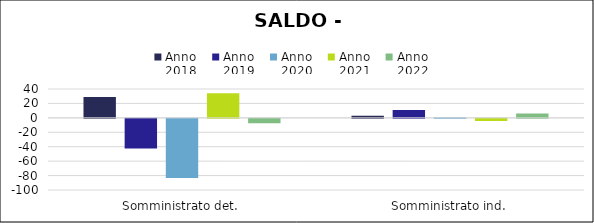
| Category | Anno
2018 | Anno
2019 | Anno
2020 | Anno
2021 | Anno
2022 |
|---|---|---|---|---|---|
| Somministrato det. | 29 | -41 | -82 | 34 | -6 |
| Somministrato ind. | 3 | 11 | 1 | -3 | 6 |